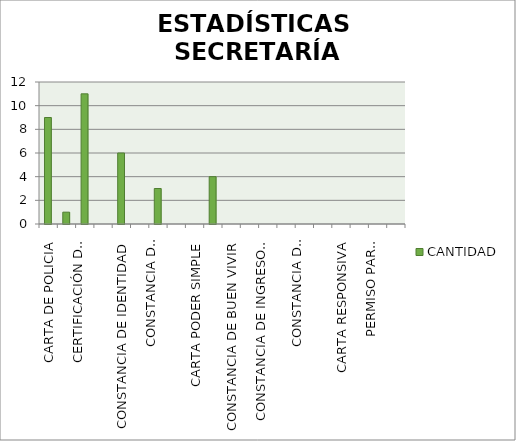
| Category | CANTIDAD |
|---|---|
| CARTA DE POLICIA | 9 |
| CERTIFICACIÓN SIMPLE | 1 |
| CERTIFICACIÓN DE ACUERDOS | 11 |
| CERTIFICACIÓN DE ARRENDAMIENTO | 0 |
| CONSTANCIA DE IDENTIDAD | 6 |
| CONSTANCIA DE DOMICILIO | 0 |
| CONSTANCIA DE RESIDENCIA | 3 |
| CARTA DE ORIGEN | 0 |
| CARTA PODER SIMPLE | 0 |
| CARTA DE RECOMENDACIÓN | 4 |
| CONSTANCIA DE BUEN VIVIR | 0 |
| CONSTANCIA DE DEPENDENCIA ECONOMICA | 0 |
| CONSTANCIA DE INGRESOS Y/O EGRESOS | 0 |
| CONSTANCIA DE TRABAJO | 0 |
| CONSTANCIA DE IDENTIFICACIÓN | 0 |
| CONSTANCIA PARA DESARROLLO RURAL | 0 |
| CARTA RESPONSIVA | 0 |
| CONTRATO DE ARRENDAMIENTO | 0 |
| PERMISO PARA VENDEDORES | 0 |
| INFORME | 0 |